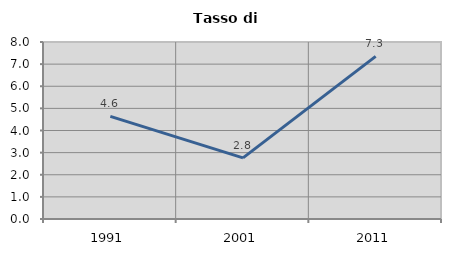
| Category | Tasso di disoccupazione   |
|---|---|
| 1991.0 | 4.637 |
| 2001.0 | 2.763 |
| 2011.0 | 7.348 |